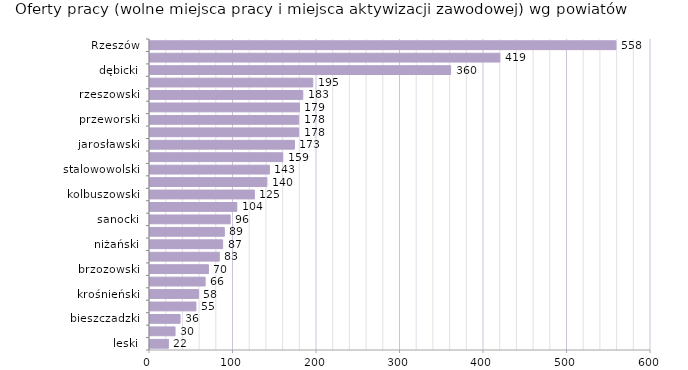
| Category | Oferty pracy (wolne miejsca pracy i miejsca aktywizacji zawodowej) wg powiatów |
|---|---|
| leski | 22 |
| przemyski | 30 |
| bieszczadzki | 36 |
| lubaczowski | 55 |
| krośnieński | 58 |
| Krosno | 66 |
| brzozowski | 70 |
| łańcucki | 83 |
| niżański | 87 |
| Przemyśl | 89 |
| sanocki | 96 |
| leżajski | 104 |
| kolbuszowski | 125 |
| Tarnobrzeg | 140 |
| stalowowolski | 143 |
| ropczycko-sędziszowski | 159 |
| jarosławski | 173 |
| jasielski | 178 |
| przeworski | 178 |
| strzyżowski | 179 |
| rzeszowski | 183 |
| tarnobrzeski  | 195 |
| dębicki | 360 |
| mielecki | 419 |
| Rzeszów | 558 |